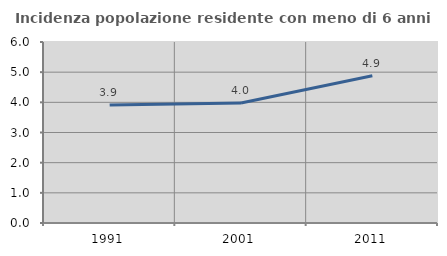
| Category | Incidenza popolazione residente con meno di 6 anni |
|---|---|
| 1991.0 | 3.916 |
| 2001.0 | 3.979 |
| 2011.0 | 4.881 |